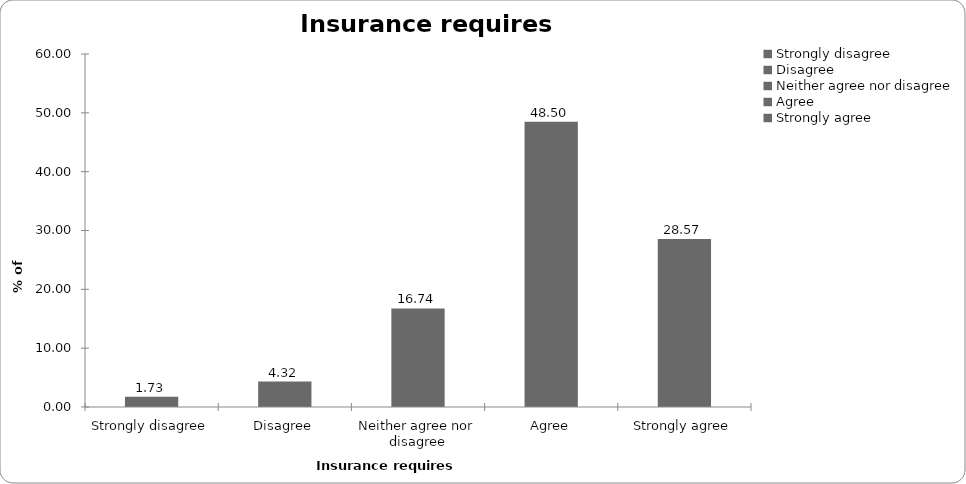
| Category | Insurance requires regulation |
|---|---|
| Strongly disagree | 1.728 |
| Disagree | 4.319 |
| Neither agree nor disagree | 16.744 |
| Agree | 48.505 |
| Strongly agree | 28.571 |